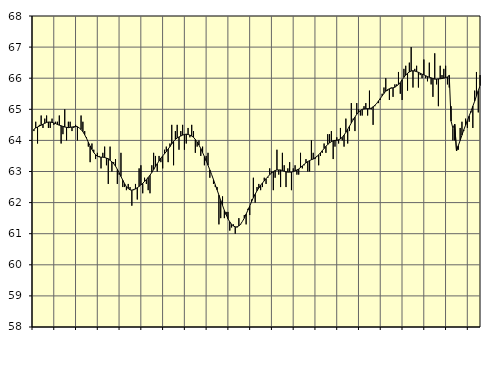
| Category | Piggar | Series 1 |
|---|---|---|
| nan | 64.3 | 64.36 |
| 1.0 | 64.6 | 64.4 |
| 1.0 | 63.9 | 64.43 |
| 1.0 | 64.5 | 64.46 |
| 1.0 | 64.8 | 64.49 |
| 1.0 | 64.4 | 64.52 |
| 1.0 | 64.7 | 64.55 |
| 1.0 | 64.8 | 64.58 |
| 1.0 | 64.4 | 64.59 |
| 1.0 | 64.4 | 64.59 |
| 1.0 | 64.7 | 64.58 |
| 1.0 | 64.5 | 64.56 |
| nan | 64.6 | 64.54 |
| 2.0 | 64.6 | 64.51 |
| 2.0 | 64.8 | 64.49 |
| 2.0 | 63.9 | 64.47 |
| 2.0 | 64.2 | 64.45 |
| 2.0 | 65 | 64.43 |
| 2.0 | 64 | 64.42 |
| 2.0 | 64.6 | 64.41 |
| 2.0 | 64.6 | 64.42 |
| 2.0 | 64.3 | 64.43 |
| 2.0 | 64.4 | 64.44 |
| 2.0 | 64.5 | 64.45 |
| nan | 64 | 64.44 |
| 3.0 | 64.4 | 64.4 |
| 3.0 | 64.8 | 64.35 |
| 3.0 | 64.6 | 64.28 |
| 3.0 | 64.3 | 64.18 |
| 3.0 | 64.1 | 64.07 |
| 3.0 | 63.8 | 63.94 |
| 3.0 | 63.3 | 63.82 |
| 3.0 | 63.9 | 63.71 |
| 3.0 | 63.7 | 63.61 |
| 3.0 | 63.4 | 63.54 |
| 3.0 | 63.6 | 63.49 |
| nan | 63.5 | 63.47 |
| 4.0 | 63.1 | 63.46 |
| 4.0 | 63.6 | 63.46 |
| 4.0 | 63.8 | 63.45 |
| 4.0 | 63.2 | 63.43 |
| 4.0 | 62.6 | 63.41 |
| 4.0 | 63.8 | 63.36 |
| 4.0 | 63 | 63.31 |
| 4.0 | 63.3 | 63.25 |
| 4.0 | 63.4 | 63.17 |
| 4.0 | 62.6 | 63.07 |
| 4.0 | 62.9 | 62.96 |
| nan | 63.6 | 62.84 |
| 5.0 | 62.5 | 62.72 |
| 5.0 | 62.5 | 62.61 |
| 5.0 | 62.4 | 62.51 |
| 5.0 | 62.6 | 62.45 |
| 5.0 | 62.5 | 62.41 |
| 5.0 | 61.9 | 62.4 |
| 5.0 | 62.4 | 62.42 |
| 5.0 | 62.6 | 62.44 |
| 5.0 | 62.1 | 62.48 |
| 5.0 | 63.1 | 62.52 |
| 5.0 | 63.2 | 62.57 |
| nan | 62.3 | 62.62 |
| 6.0 | 62.8 | 62.68 |
| 6.0 | 62.6 | 62.74 |
| 6.0 | 62.4 | 62.81 |
| 6.0 | 62.3 | 62.88 |
| 6.0 | 63.2 | 62.97 |
| 6.0 | 63.6 | 63.06 |
| 6.0 | 63.5 | 63.16 |
| 6.0 | 63 | 63.25 |
| 6.0 | 63.5 | 63.34 |
| 6.0 | 63.3 | 63.43 |
| 6.0 | 63.1 | 63.5 |
| nan | 63.7 | 63.57 |
| 7.0 | 63.8 | 63.64 |
| 7.0 | 63.3 | 63.72 |
| 7.0 | 63.9 | 63.8 |
| 7.0 | 64.5 | 63.89 |
| 7.0 | 63.2 | 63.97 |
| 7.0 | 64.3 | 64.03 |
| 7.0 | 64.5 | 64.08 |
| 7.0 | 63.7 | 64.11 |
| 7.0 | 64.3 | 64.14 |
| 7.0 | 64.5 | 64.17 |
| 7.0 | 63.7 | 64.19 |
| nan | 63.9 | 64.2 |
| 8.0 | 64.4 | 64.19 |
| 8.0 | 64.1 | 64.17 |
| 8.0 | 64.5 | 64.14 |
| 8.0 | 64.3 | 64.1 |
| 8.0 | 63.6 | 64.03 |
| 8.0 | 63.8 | 63.95 |
| 8.0 | 64 | 63.85 |
| 8.0 | 63.5 | 63.74 |
| 8.0 | 63.8 | 63.61 |
| 8.0 | 63.2 | 63.48 |
| 8.0 | 63.5 | 63.34 |
| nan | 63.6 | 63.2 |
| 9.0 | 62.8 | 63.05 |
| 9.0 | 62.9 | 62.9 |
| 9.0 | 62.6 | 62.74 |
| 9.0 | 62.5 | 62.57 |
| 9.0 | 62.5 | 62.41 |
| 9.0 | 61.3 | 62.24 |
| 9.0 | 61.5 | 62.07 |
| 9.0 | 62.2 | 61.91 |
| 9.0 | 61.5 | 61.75 |
| 9.0 | 61.7 | 61.61 |
| 9.0 | 61.7 | 61.48 |
| nan | 61.1 | 61.38 |
| 10.0 | 61.2 | 61.3 |
| 10.0 | 61.3 | 61.25 |
| 10.0 | 61 | 61.22 |
| 10.0 | 61.2 | 61.22 |
| 10.0 | 61.5 | 61.25 |
| 10.0 | 61.3 | 61.31 |
| 10.0 | 61.4 | 61.4 |
| 10.0 | 61.6 | 61.5 |
| 10.0 | 61.3 | 61.63 |
| 10.0 | 61.8 | 61.76 |
| 10.0 | 61.6 | 61.89 |
| nan | 62.1 | 62.03 |
| 11.0 | 62.8 | 62.16 |
| 11.0 | 62 | 62.27 |
| 11.0 | 62.5 | 62.38 |
| 11.0 | 62.6 | 62.47 |
| 11.0 | 62.4 | 62.56 |
| 11.0 | 62.5 | 62.63 |
| 11.0 | 62.8 | 62.7 |
| 11.0 | 62.6 | 62.77 |
| 11.0 | 62.8 | 62.83 |
| 11.0 | 63.1 | 62.9 |
| 11.0 | 63 | 62.95 |
| nan | 62.4 | 63 |
| 12.0 | 62.8 | 63.03 |
| 12.0 | 63.7 | 63.05 |
| 12.0 | 62.9 | 63.05 |
| 12.0 | 62.5 | 63.05 |
| 12.0 | 63.6 | 63.03 |
| 12.0 | 63.2 | 63.01 |
| 12.0 | 62.5 | 62.99 |
| 12.0 | 63.1 | 62.98 |
| 12.0 | 63.3 | 62.98 |
| 12.0 | 62.4 | 62.98 |
| 12.0 | 63.1 | 63 |
| nan | 63.2 | 63.02 |
| 13.0 | 62.9 | 63.05 |
| 13.0 | 62.9 | 63.08 |
| 13.0 | 63.6 | 63.13 |
| 13.0 | 63.1 | 63.18 |
| 13.0 | 63.2 | 63.23 |
| 13.0 | 63.4 | 63.28 |
| 13.0 | 63 | 63.32 |
| 13.0 | 63 | 63.35 |
| 13.0 | 64 | 63.38 |
| 13.0 | 63.6 | 63.4 |
| 13.0 | 63.4 | 63.44 |
| nan | 63.5 | 63.48 |
| 14.0 | 63.2 | 63.54 |
| 14.0 | 63.5 | 63.6 |
| 14.0 | 63.6 | 63.67 |
| 14.0 | 63.9 | 63.74 |
| 14.0 | 63.6 | 63.81 |
| 14.0 | 64.2 | 63.87 |
| 14.0 | 64.2 | 63.92 |
| 14.0 | 64.3 | 63.96 |
| 14.0 | 63.4 | 63.99 |
| 14.0 | 63.8 | 64 |
| 14.0 | 64.1 | 64 |
| nan | 63.9 | 64.02 |
| 15.0 | 64.4 | 64.05 |
| 15.0 | 64 | 64.1 |
| 15.0 | 63.8 | 64.17 |
| 15.0 | 64.7 | 64.26 |
| 15.0 | 63.9 | 64.36 |
| 15.0 | 64.3 | 64.46 |
| 15.0 | 65.2 | 64.56 |
| 15.0 | 64.7 | 64.66 |
| 15.0 | 64.3 | 64.75 |
| 15.0 | 65.2 | 64.84 |
| 15.0 | 65 | 64.91 |
| nan | 64.8 | 64.96 |
| 16.0 | 64.8 | 65 |
| 16.0 | 65.1 | 65.01 |
| 16.0 | 65.2 | 65.02 |
| 16.0 | 64.8 | 65.02 |
| 16.0 | 65.6 | 65.02 |
| 16.0 | 65 | 65.04 |
| 16.0 | 64.5 | 65.08 |
| 16.0 | 65.1 | 65.13 |
| 16.0 | 65.2 | 65.19 |
| 16.0 | 65.2 | 65.27 |
| 16.0 | 65.3 | 65.35 |
| nan | 65.5 | 65.43 |
| 17.0 | 65.7 | 65.51 |
| 17.0 | 66 | 65.58 |
| 17.0 | 65.6 | 65.63 |
| 17.0 | 65.3 | 65.66 |
| 17.0 | 65.7 | 65.68 |
| 17.0 | 65.4 | 65.69 |
| 17.0 | 65.8 | 65.71 |
| 17.0 | 65.8 | 65.75 |
| 17.0 | 66.2 | 65.8 |
| 17.0 | 65.5 | 65.86 |
| 17.0 | 65.3 | 65.95 |
| nan | 66.3 | 66.03 |
| 18.0 | 66.4 | 66.1 |
| 18.0 | 65.6 | 66.16 |
| 18.0 | 66.5 | 66.2 |
| 18.0 | 67 | 66.23 |
| 18.0 | 65.7 | 66.24 |
| 18.0 | 66.3 | 66.23 |
| 18.0 | 66.4 | 66.21 |
| 18.0 | 65.7 | 66.19 |
| 18.0 | 66.1 | 66.16 |
| 18.0 | 66 | 66.13 |
| 18.0 | 66.6 | 66.11 |
| nan | 66 | 66.08 |
| 19.0 | 65.9 | 66.05 |
| 19.0 | 66.5 | 66.03 |
| 19.0 | 65.8 | 66.01 |
| 19.0 | 65.4 | 65.99 |
| 19.0 | 66.8 | 65.97 |
| 19.0 | 65.8 | 65.97 |
| 19.0 | 65.1 | 65.98 |
| 19.0 | 66.4 | 65.98 |
| 19.0 | 66.1 | 65.99 |
| 19.0 | 66.3 | 66 |
| 19.0 | 66.4 | 66.02 |
| nan | 65.8 | 66.04 |
| 20.0 | 65.7 | 66.09 |
| 20.0 | 65.1 | 64.62 |
| 20.0 | 64 | 64.39 |
| 20.0 | 64 | 64.52 |
| 20.0 | 63.7 | 63.66 |
| 20.0 | 63.7 | 63.83 |
| 20.0 | 64.4 | 64 |
| 20.0 | 64.6 | 64.17 |
| 20.0 | 64.3 | 64.34 |
| 20.0 | 64.7 | 64.49 |
| 20.0 | 64.4 | 64.64 |
| nan | 64.6 | 64.79 |
| 21.0 | 64.9 | 64.94 |
| 21.0 | 64.4 | 65.1 |
| 21.0 | 65.6 | 65.26 |
| 21.0 | 66.2 | 65.43 |
| 21.0 | 64.9 | 65.6 |
| 21.0 | 66.1 | 65.76 |